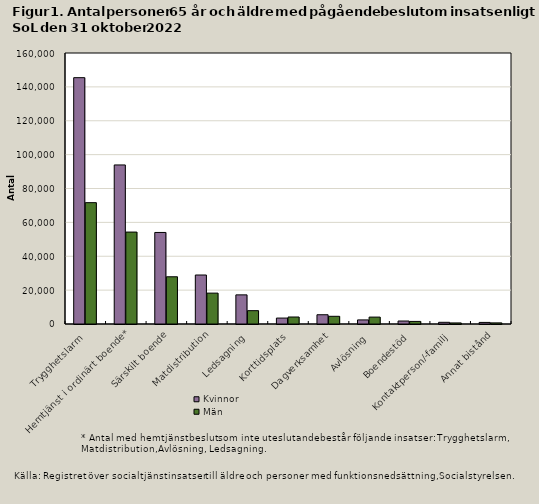
| Category | Kvinnor | Män |
|---|---|---|
| Trygghetslarm | 145441 | 71647 |
| Hemtjänst i ordinärt boende* | 93904 | 54276 |
| Särskilt boende | 54049 | 27885 |
| Matdistribution | 28925 | 18238 |
| Ledsagning | 17204 | 7870 |
| Korttidsplats | 3498 | 4130 |
| Dagverksamhet | 5468 | 4547 |
| Avlösning | 2415 | 4070 |
| Boendestöd | 1757 | 1526 |
| Kontaktperson/-familj | 997 | 629 |
| Annat bistånd | 932 | 663 |